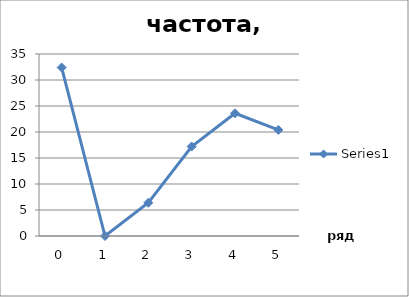
| Category | Series 0 |
|---|---|
| 0.0 | 32.4 |
| 1.0 | 0 |
| 2.0 | 6.4 |
| 3.0 | 17.2 |
| 4.0 | 23.6 |
| 5.0 | 20.4 |